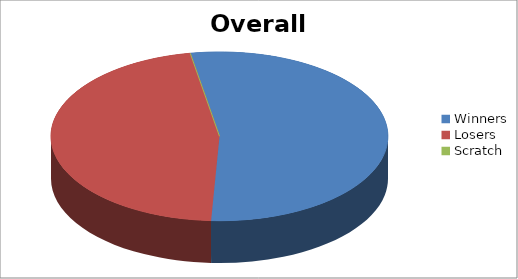
| Category | Series 1 |
|---|---|
| Winners | 15 |
| Losers | 13 |
| Scratch | 0 |